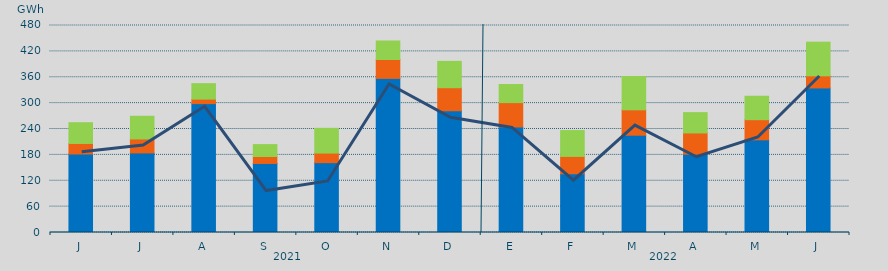
| Category | Asignación SEPE | Asignación Francia | Asignación Portugal |
|---|---|---|---|
| J | 182049.8 | 24417.4 | 48121.8 |
| J | 184550.8 | 32356.7 | 52628.6 |
| A | 298829.9 | 10422.8 | 35868.4 |
| S | 160066 | 16160 | 27614.8 |
| O | 161949.6 | 22251.7 | 57303 |
| N | 357339.7 | 43842.5 | 42886.3 |
| D | 282259.4 | 53460 | 61129.1 |
| E | 244787.3 | 56434 | 41874.5 |
| F | 136191.8 | 40226.7 | 59973 |
| M | 225622.7 | 58889.7 | 77145.2 |
| A | 181585.4 | 49218 | 47192.7 |
| M | 214905.3 | 46679.2 | 54371.7 |
| J | 335176.8 | 28179 | 77960.7 |